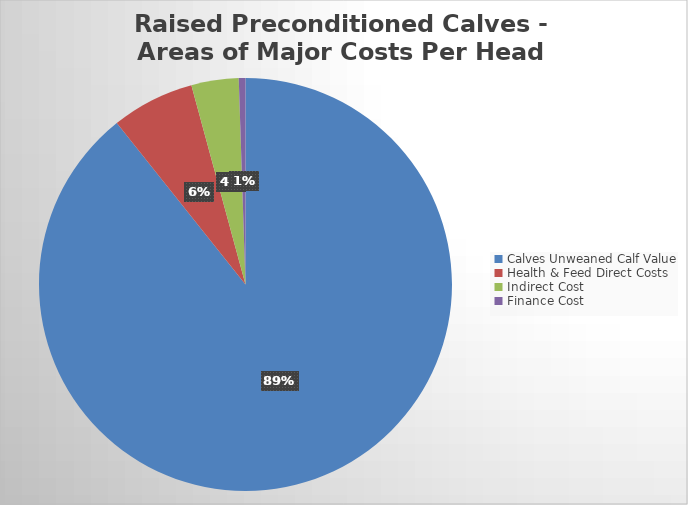
| Category | Series 0 |
|---|---|
| Calves Unweaned Calf Value | 815.044 |
| Health & Feed Direct Costs | 59.25 |
| Indirect Cost | 33.75 |
| Finance Cost | 4.78 |